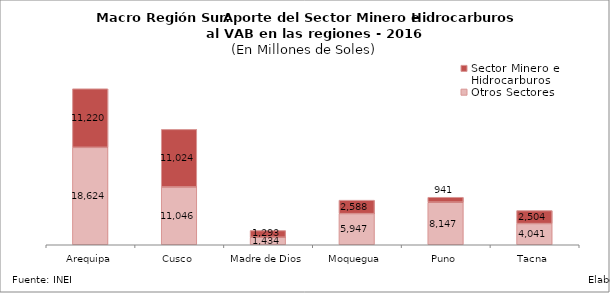
| Category | Otros Sectores | Sector Minero e Hidrocarburos |
|---|---|---|
| Arequipa | 18624.244 | 11220.487 |
| Cusco | 11045.913 | 11024.423 |
| Madre de Dios | 1433.676 | 1292.704 |
| Moquegua | 5946.854 | 2587.892 |
| Puno | 8146.735 | 941.168 |
| Tacna | 4040.797 | 2504.409 |